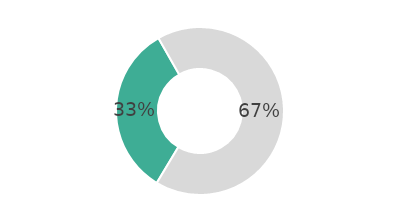
| Category | Series 0 |
|---|---|
| 0 | 33.148 |
| 1 | 66.852 |